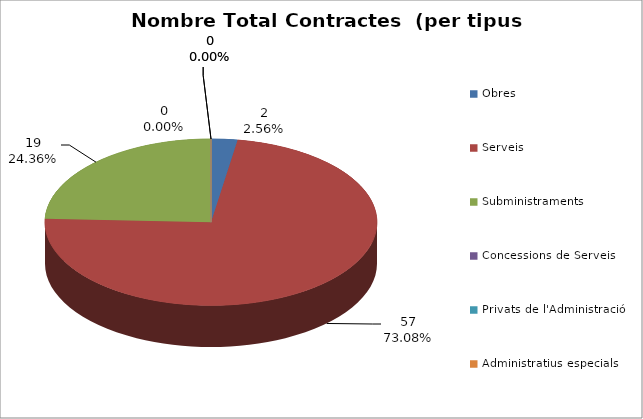
| Category | Nombre Total Contractes |
|---|---|
| Obres | 2 |
| Serveis | 57 |
| Subministraments | 19 |
| Concessions de Serveis | 0 |
| Privats de l'Administració | 0 |
| Administratius especials | 0 |